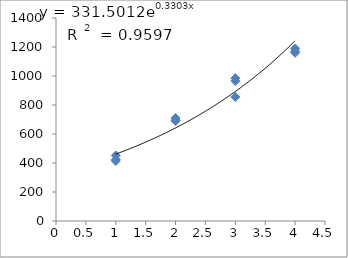
| Category | Series 0 |
|---|---|
| 1.0 | 424 |
| 1.0 | 452 |
| 1.0 | 414 |
| 2.0 | 710 |
| 2.0 | 690 |
| 2.0 | 695 |
| 3.0 | 855 |
| 3.0 | 965 |
| 3.0 | 985 |
| 4.0 | 1190 |
| 4.0 | 1170 |
| 4.0 | 1160 |